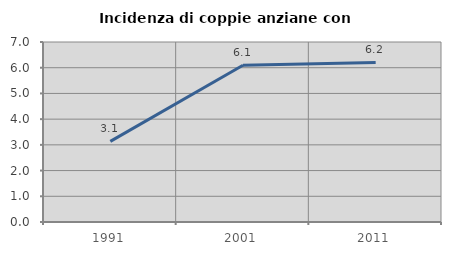
| Category | Incidenza di coppie anziane con figli |
|---|---|
| 1991.0 | 3.137 |
| 2001.0 | 6.093 |
| 2011.0 | 6.207 |